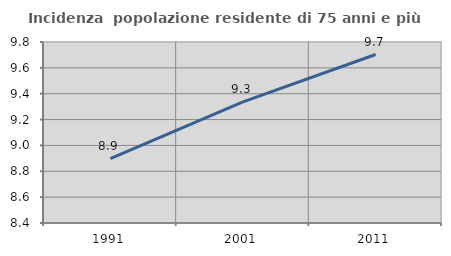
| Category | Incidenza  popolazione residente di 75 anni e più |
|---|---|
| 1991.0 | 8.898 |
| 2001.0 | 9.337 |
| 2011.0 | 9.703 |